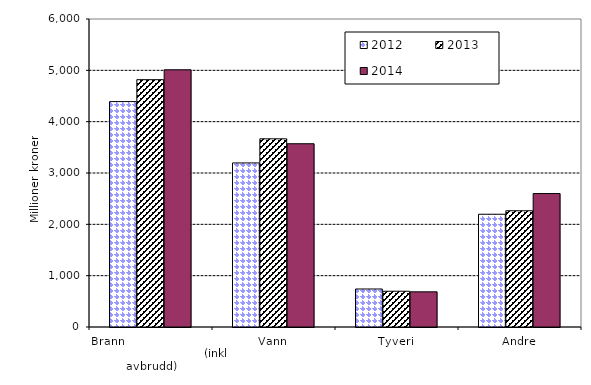
| Category | 2012 | 2013 | 2014 |
|---|---|---|---|
| Brann                                                       (inkl avbrudd) | 4391.184 | 4817.943 | 5010.408 |
| Vann | 3196.153 | 3665.899 | 3569.905 |
| Tyveri | 740.391 | 696.534 | 684.937 |
| Andre | 2196.642 | 2264.482 | 2599.653 |